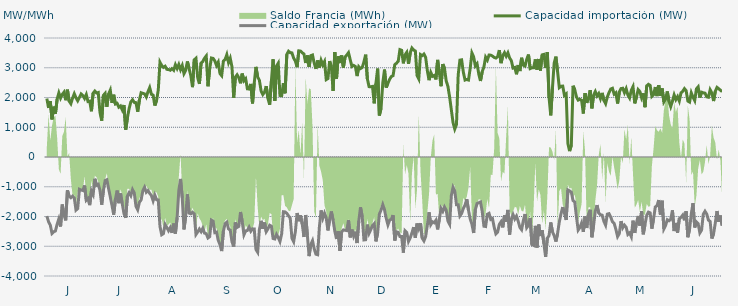
| Category | Capacidad importación (MW) | Capacidad exportación (MW) |
|---|---|---|
| 0 | 1964.583 | -1985.792 |
| 1900-01-01 | 1650 | -2177.417 |
| 1900-01-02 | 1877.083 | -2287.667 |
| 1900-01-03 | 1264.583 | -2568.708 |
| 1900-01-04 | 1691.667 | -2512.667 |
| 1900-01-05 | 1456.25 | -2486.333 |
| 1900-01-06 | 1945.833 | -2259.083 |
| 1900-01-07 | 2154.167 | -2079.5 |
| 1900-01-08 | 1979.167 | -2336.083 |
| 1900-01-09 | 2104.167 | -1597.917 |
| 1900-01-10 | 2179.167 | -1954.167 |
| 1900-01-11 | 1908.333 | -2131.25 |
| 1900-01-12 | 2262.5 | -1118.75 |
| 1900-01-13 | 1879.167 | -1314.583 |
| 1900-01-14 | 1791.667 | -1368 |
| 1900-01-15 | 1977.083 | -1316.667 |
| 1900-01-16 | 2127.083 | -1377.083 |
| 1900-01-17 | 1987.5 | -1785.417 |
| 1900-01-18 | 1887.5 | -1733.333 |
| 1900-01-19 | 2002.083 | -1085.417 |
| 1900-01-20 | 2118.75 | -1110.417 |
| 1900-01-21 | 2066.667 | -1125 |
| 1900-01-22 | 1966.667 | -958.333 |
| 1900-01-23 | 2097.917 | -1454.167 |
| 1900-01-24 | 1864.583 | -1397.917 |
| 1900-01-25 | 1877.083 | -1618.75 |
| 1900-01-26 | 1537.5 | -1143.75 |
| 1900-01-27 | 2145.833 | -1264 |
| 1900-01-28 | 2216.667 | -731.25 |
| 1900-01-29 | 2150 | -950 |
| 1900-01-30 | 2167.583 | -916.667 |
| 1900-01-31 | 1493.75 | -1122.25 |
| 1900-02-01 | 1220.833 | -1604.167 |
| 1900-02-02 | 2072.917 | -1125 |
| 1900-02-03 | 2139.583 | -791.667 |
| 1900-02-04 | 1687.5 | -764.583 |
| 1900-02-05 | 2116.667 | -1058.333 |
| 1900-02-06 | 2247.917 | -1337.5 |
| 1900-02-07 | 1818.75 | -1627.083 |
| 1900-02-08 | 2093.75 | -1937.5 |
| 1900-02-09 | 1781.25 | -1422.917 |
| 1900-02-10 | 1804.167 | -1127.083 |
| 1900-02-11 | 1675 | -1552.083 |
| 1900-02-12 | 1716.667 | -1225 |
| 1900-02-13 | 1583.333 | -1570.833 |
| 1900-02-14 | 1747.917 | -1904.167 |
| 1900-02-15 | 918.75 | -2042.875 |
| 1900-02-16 | 1314.583 | -1310.417 |
| 1900-02-17 | 1629.167 | -1200 |
| 1900-02-18 | 1852.083 | -1300.583 |
| 1900-02-19 | 1925 | -1095.833 |
| 1900-02-20 | 1835.417 | -1208.333 |
| 1900-02-21 | 1827.083 | -1656.25 |
| 1900-02-22 | 1522.917 | -1770.917 |
| 1900-02-23 | 1916.667 | -1518.75 |
| 1900-02-24 | 2160.417 | -1441.667 |
| 1900-02-25 | 2139.583 | -1137.5 |
| 1900-02-26 | 2120.833 | -1018.75 |
| 1900-02-27 | 2018.75 | -1183.333 |
| 1900-02-28 | 2193.75 | -1127.083 |
| 1900-02-28 | 2333.333 | -1220.833 |
| 1900-03-01 | 2108.333 | -1295.833 |
| 1900-03-02 | 2079.833 | -1472.917 |
| 1900-03-03 | 1729.167 | -1281.25 |
| 1900-03-04 | 1897.917 | -1434.542 |
| 1900-03-05 | 2247 | -1443.75 |
| 1900-03-06 | 3185.083 | -2337 |
| 1900-03-07 | 3075.167 | -2613.625 |
| 1900-03-08 | 3013.625 | -2576.5 |
| 1900-03-09 | 3052.042 | -2269.25 |
| 1900-03-10 | 2946.333 | -2370.833 |
| 1900-03-11 | 2940.542 | -2478.958 |
| 1900-03-12 | 2917.208 | -2375.625 |
| 1900-03-13 | 2971.167 | -2551.875 |
| 1900-03-14 | 2917.292 | -2238 |
| 1900-03-15 | 3101.958 | -2573.167 |
| 1900-03-16 | 2973.375 | -2041.667 |
| 1900-03-17 | 3109.875 | -1120.167 |
| 1900-03-18 | 2936.333 | -737.5 |
| 1900-03-19 | 3074.833 | -1371.667 |
| 1900-03-20 | 2802.417 | -2434.917 |
| 1900-03-21 | 2913.625 | -1996.875 |
| 1900-03-22 | 3212.125 | -1254.167 |
| 1900-03-23 | 2973 | -1887.5 |
| 1900-03-24 | 2732 | -1910.417 |
| 1900-03-25 | 2348.333 | -1858 |
| 1900-03-26 | 3266 | -1911.25 |
| 1900-03-27 | 3318.417 | -2603.917 |
| 1900-03-28 | 2666.292 | -2519.292 |
| 1900-03-29 | 2457.667 | -2420.375 |
| 1900-03-30 | 3159.917 | -2510.583 |
| 1900-03-31 | 3208.208 | -2395.833 |
| 1900-04-01 | 3322.042 | -2559.25 |
| 1900-04-02 | 3397.292 | -2579.208 |
| 1900-04-03 | 2377.292 | -2722 |
| 1900-04-04 | 2966.875 | -2678.583 |
| 1900-04-05 | 3327.583 | -2120.833 |
| 1900-04-06 | 3314.125 | -2154.167 |
| 1900-04-07 | 3229.625 | -2542.417 |
| 1900-04-08 | 3075.125 | -2524.125 |
| 1900-04-09 | 3186.833 | -2800.875 |
| 1900-04-10 | 2804.417 | -2944.208 |
| 1900-04-11 | 2733.75 | -3162.5 |
| 1900-04-12 | 3225.458 | -2491.042 |
| 1900-04-13 | 3275.667 | -2238.417 |
| 1900-04-14 | 3439.5 | -2190.417 |
| 1900-04-15 | 3175.292 | -2417.375 |
| 1900-04-16 | 3321.875 | -2458.417 |
| 1900-04-17 | 3034.917 | -2846.167 |
| 1900-04-18 | 1991.917 | -3010.667 |
| 1900-04-19 | 2685.833 | -2200.25 |
| 1900-04-20 | 2763.167 | -2365.208 |
| 1900-04-21 | 2664.875 | -2334.375 |
| 1900-04-22 | 2477.792 | -1849.417 |
| 1900-04-23 | 2804.25 | -2175.083 |
| 1900-04-24 | 2563.458 | -2614.833 |
| 1900-04-25 | 2629.917 | -2484.333 |
| 1900-04-26 | 2292 | -2469.792 |
| 1900-04-27 | 2284.542 | -2356.917 |
| 1900-04-28 | 2456.5 | -2494.792 |
| 1900-04-29 | 1801.792 | -2413.833 |
| 1900-04-30 | 2484.917 | -2419 |
| 1900-05-01 | 3029.417 | -3108.292 |
| 1900-05-02 | 2693.417 | -3201.125 |
| 1900-05-03 | 2579.5 | -2439 |
| 1900-05-04 | 2220.833 | -2146.167 |
| 1900-05-05 | 2100 | -2410.292 |
| 1900-05-06 | 2179.167 | -2202.083 |
| 1900-05-07 | 2381.25 | -2508.5 |
| 1900-05-08 | 1970.833 | -2414.375 |
| 1900-05-09 | 1758.333 | -2292.792 |
| 1900-05-10 | 2544 | -2324.083 |
| 1900-05-11 | 3285.125 | -2739.75 |
| 1900-05-12 | 1885.375 | -2754.917 |
| 1900-05-13 | 3057.958 | -2601 |
| 1900-05-14 | 3152.583 | -2708.375 |
| 1900-05-15 | 2068.833 | -2840.833 |
| 1900-05-16 | 2060.917 | -2586.417 |
| 1900-05-17 | 2484.25 | -1839.417 |
| 1900-05-18 | 2141.208 | -1845.833 |
| 1900-05-19 | 3445.375 | -1893.75 |
| 1900-05-20 | 3555.25 | -1979.583 |
| 1900-05-21 | 3506.875 | -2054.167 |
| 1900-05-22 | 3499.292 | -2730 |
| 1900-05-23 | 3321.917 | -2848.375 |
| 1900-05-24 | 3225.583 | -2505.583 |
| 1900-05-25 | 3019.583 | -1882.958 |
| 1900-05-26 | 3568.667 | -2157.833 |
| 1900-05-27 | 3559.375 | -1957.75 |
| 1900-05-28 | 3503.125 | -2252.375 |
| 1900-05-29 | 3464.458 | -2689.458 |
| 1900-05-30 | 3159.52 | -1949.52 |
| 1900-05-31 | 3414.875 | -2624.75 |
| 1900-06-01 | 3028.417 | -3331.875 |
| 1900-06-02 | 3406.833 | -2936.5 |
| 1900-06-03 | 3428.875 | -2811.25 |
| 1900-06-04 | 3154.208 | -3088.625 |
| 1900-06-05 | 2961.542 | -3268.083 |
| 1900-06-06 | 3246.75 | -3285.125 |
| 1900-06-07 | 2998.792 | -2359.333 |
| 1900-06-08 | 3250.625 | -1795.833 |
| 1900-06-09 | 3098.083 | -2058.458 |
| 1900-06-10 | 3208.458 | -1889.583 |
| 1900-06-11 | 2600.833 | -2050 |
| 1900-06-12 | 2636.458 | -2468.208 |
| 1900-06-13 | 3221.75 | -2100 |
| 1900-06-14 | 3030.917 | -1831.25 |
| 1900-06-15 | 2221.417 | -2127.083 |
| 1900-06-16 | 3529.833 | -2490.5 |
| 1900-06-17 | 2631.583 | -2756.25 |
| 1900-06-18 | 3389.417 | -2493.667 |
| 1900-06-19 | 3161.917 | -3158.375 |
| 1900-06-20 | 3412.417 | -2518.792 |
| 1900-06-21 | 3004.917 | -2450.333 |
| 1900-06-22 | 3360.75 | -2463.25 |
| 1900-06-23 | 3427.958 | -2474.292 |
| 1900-06-24 | 3506.917 | -2123.5 |
| 1900-06-25 | 3269.708 | -2701.708 |
| 1900-06-26 | 3043.333 | -2440.417 |
| 1900-06-27 | 3078.833 | -2660.667 |
| 1900-06-28 | 3042.542 | -2510.25 |
| 1900-06-29 | 2720.083 | -2892.208 |
| 1900-06-30 | 3035.792 | -2156.833 |
| 1900-07-01 | 2973.125 | -1691.667 |
| 1900-07-02 | 3008.708 | -2006.25 |
| 1900-07-03 | 3198.417 | -2788.271 |
| 1900-07-04 | 3439.5 | -2780.875 |
| 1900-07-05 | 2626.625 | -2273 |
| 1900-07-06 | 2364.583 | -2564.167 |
| 1900-07-07 | 2360.417 | -2440.708 |
| 1900-07-08 | 2372.917 | -2302.125 |
| 1900-07-09 | 1804.167 | -2241.25 |
| 1900-07-10 | 2476.875 | -2836.292 |
| 1900-07-11 | 2972.208 | -2552.292 |
| 1900-07-12 | 1394.917 | -1922 |
| 1900-07-13 | 1635.417 | -1780.667 |
| 1900-07-14 | 2487.208 | -1602.083 |
| 1900-07-15 | 2938.333 | -1770.833 |
| 1900-07-16 | 2333.708 | -2058.75 |
| 1900-07-17 | 2480.333 | -2280.5 |
| 1900-07-18 | 2612.458 | -2120.333 |
| 1900-07-19 | 2705.792 | -2095.25 |
| 1900-07-20 | 2735.375 | -1951.833 |
| 1900-07-21 | 3100.375 | -2807.583 |
| 1900-07-22 | 3154.125 | -2514.417 |
| 1900-07-23 | 3216.042 | -2530.208 |
| 1900-07-24 | 3609.167 | -2672.875 |
| 1900-07-25 | 3585.958 | -2674.5 |
| 1900-07-26 | 3148.417 | -3214.25 |
| 1900-07-27 | 3433.542 | -2480.667 |
| 1900-07-28 | 3518.5 | -2539.5 |
| 1900-07-29 | 3130.292 | -2838.583 |
| 1900-07-30 | 3499.167 | -2718.417 |
| 1900-07-31 | 3663.042 | -2554.083 |
| 1900-08-01 | 3596.708 | -2355.75 |
| 1900-08-02 | 3562.792 | -2716.417 |
| 1900-08-03 | 2738.75 | -2235.333 |
| 1900-08-04 | 2625.667 | -2410 |
| 1900-08-05 | 3444.083 | -2226.333 |
| 1900-08-06 | 3408.75 | -2728 |
| 1900-08-07 | 3460.583 | -2820.25 |
| 1900-08-08 | 3350.75 | -2676.083 |
| 1900-08-09 | 2899.917 | -2289.583 |
| 1900-08-10 | 2581.708 | -1858.083 |
| 1900-08-11 | 2842.042 | -2272.417 |
| 1900-08-12 | 2711.125 | -2177.417 |
| 1900-08-13 | 2740.458 | -2209.667 |
| 1900-08-14 | 2608.583 | -2127.083 |
| 1900-08-15 | 3264.042 | -2433.083 |
| 1900-08-16 | 2836.375 | -2085.417 |
| 1900-08-17 | 2379.792 | -1727.083 |
| 1900-08-18 | 3123.25 | -1827.083 |
| 1900-08-19 | 2982.792 | -1681.25 |
| 1900-08-20 | 2556.667 | -1789.667 |
| 1900-08-21 | 2375.667 | -2149.333 |
| 1900-08-22 | 2017.208 | -2261.458 |
| 1900-08-23 | 1585 | -1297.917 |
| 1900-08-24 | 1154.167 | -1022.917 |
| 1900-08-25 | 939.583 | -1143.75 |
| 1900-08-26 | 1093.75 | -1604.167 |
| 1900-08-27 | 2763.333 | -1604.167 |
| 1900-08-28 | 3256.375 | -1980.875 |
| 1900-08-29 | 3265.958 | -1897.917 |
| 1900-08-30 | 2849.625 | -1726.333 |
| 1900-08-31 | 2586.542 | -1614.583 |
| 1900-09-01 | 2607.375 | -1416.667 |
| 1900-09-02 | 2587.208 | -1789.583 |
| 1900-09-03 | 2978.5 | -2081.25 |
| 1900-09-04 | 3497.083 | -2256.292 |
| 1900-09-05 | 3370 | -2554.542 |
| 1900-09-06 | 3061.75 | -1771.917 |
| 1900-09-07 | 3134.875 | -1562.5 |
| 1900-09-08 | 2789.5 | -1537.5 |
| 1900-09-09 | 2555.75 | -1512.5 |
| 1900-09-10 | 2867.083 | -1825 |
| 1900-09-11 | 3026.833 | -2326.458 |
| 1900-09-12 | 3354.833 | -2337.292 |
| 1900-09-13 | 3258.292 | -1924.167 |
| 1900-09-14 | 3426.125 | -1893.75 |
| 1900-09-15 | 3424.167 | -2100 |
| 1900-09-16 | 3391.208 | -2070.833 |
| 1900-09-17 | 3348.208 | -2362.208 |
| 1900-09-18 | 3325.958 | -2584.917 |
| 1900-09-19 | 3372.292 | -2526.125 |
| 1900-09-20 | 3594.458 | -2261.833 |
| 1900-09-21 | 3154.208 | -2177.542 |
| 1900-09-22 | 3406.542 | -2366 |
| 1900-09-23 | 3506.792 | -1962 |
| 1900-09-24 | 3388.292 | -2170.833 |
| 1900-09-25 | 3502.625 | -1778.917 |
| 1900-09-26 | 3329.875 | -2606.583 |
| 1900-09-27 | 3238.958 | -2081.917 |
| 1900-09-28 | 2990.542 | -1937.25 |
| 1900-09-29 | 3009.542 | -2084.208 |
| 1900-09-30 | 2780.333 | -1987.25 |
| 1900-10-01 | 3090.792 | -2157.25 |
| 1900-10-02 | 2889.375 | -2369.167 |
| 1900-10-03 | 3335.375 | -2443.917 |
| 1900-10-04 | 3086.625 | -2135.417 |
| 1900-10-05 | 3054 | -1916.417 |
| 1900-10-06 | 3285.417 | -2373 |
| 1900-10-07 | 3443.292 | -2289.333 |
| 1900-10-08 | 2971.208 | -2047.917 |
| 1900-10-09 | 2996.292 | -2944.458 |
| 1900-10-10 | 3001.167 | -2971.542 |
| 1900-10-11 | 3281.375 | -2314.833 |
| 1900-10-12 | 2936.042 | -3043.167 |
| 1900-10-13 | 3294.792 | -2270.333 |
| 1900-10-14 | 2907.375 | -2657.667 |
| 1900-10-15 | 3433.583 | -2462.5 |
| 1900-10-16 | 3449.042 | -2914.583 |
| 1900-10-17 | 2992.458 | -3358.458 |
| 1900-10-18 | 3524.375 | -2728.208 |
| 1900-10-19 | 2000 | -2643.375 |
| 1900-10-20 | 1400 | -2200 |
| 1900-10-21 | 2323.375 | -2514.75 |
| 1900-10-22 | 3160.167 | -2645.333 |
| 1900-10-23 | 3372.083 | -2842.167 |
| 1900-10-24 | 2865.739 | -2564.565 |
| 1900-10-25 | 2332.667 | -2181.833 |
| 1900-10-26 | 2376.083 | -1906.25 |
| 1900-10-27 | 2381.25 | -1683.333 |
| 1900-10-28 | 2070.833 | -1891.667 |
| 1900-10-29 | 2120.083 | -2118.75 |
| 1900-10-30 | 449.25 | -1108.333 |
| 1900-10-31 | 200 | -1139.583 |
| 1900-11-01 | 395.833 | -1179.167 |
| 1900-11-02 | 2393.75 | -1462.5 |
| 1900-11-03 | 2262.25 | -1512.5 |
| 1900-11-04 | 2020.833 | -2007.167 |
| 1900-11-05 | 1912.5 | -2455.208 |
| 1900-11-06 | 1939.583 | -2371.125 |
| 1900-11-07 | 1908.333 | -2217.958 |
| 1900-11-08 | 1462.5 | -2517.542 |
| 1900-11-09 | 2145.208 | -2000.417 |
| 1900-11-10 | 1820.833 | -2386.167 |
| 1900-11-11 | 1983.333 | -1930.75 |
| 1900-11-12 | 2245.833 | -1772.917 |
| 1900-11-13 | 1635.417 | -2697.5 |
| 1900-11-14 | 2079.167 | -2299.625 |
| 1900-11-15 | 2200 | -1818.75 |
| 1900-11-16 | 2052.083 | -1616.667 |
| 1900-11-17 | 2133.333 | -1885.417 |
| 1900-11-18 | 1962.5 | -1940.792 |
| 1900-11-19 | 2154.167 | -1955.875 |
| 1900-11-20 | 1906.25 | -2160.458 |
| 1900-11-21 | 1791.667 | -2289.583 |
| 1900-11-22 | 2014.583 | -1920.333 |
| 1900-11-23 | 2166.667 | -1904.167 |
| 1900-11-24 | 2285.417 | -2016.25 |
| 1900-11-25 | 2310.417 | -2177.917 |
| 1900-11-26 | 2114.583 | -2230.875 |
| 1900-11-27 | 2160.417 | -2431.625 |
| 1900-11-28 | 1797.917 | -2674.417 |
| 1900-11-29 | 2180.625 | -2574 |
| 1900-11-30 | 2300 | -2155.333 |
| 1900-12-01 | 2310.417 | -2380.708 |
| 1900-12-02 | 2160.417 | -2290.5 |
| 1900-12-03 | 2295.833 | -2360.958 |
| 1900-12-04 | 2083.333 | -2603 |
| 1900-12-05 | 1983.333 | -2551.458 |
| 1900-12-06 | 2243.75 | -2680.375 |
| 1900-12-07 | 2364.583 | -2139.583 |
| 1900-12-08 | 1802.083 | -2551.375 |
| 1900-12-09 | 2012.5 | -2222.583 |
| 1900-12-10 | 2264.583 | -1983.333 |
| 1900-12-11 | 2200 | -2304.167 |
| 1900-12-12 | 1991.667 | -1823 |
| 1900-12-13 | 2139.583 | -2598.667 |
| 1900-12-14 | 1674.583 | -2262.5 |
| 1900-12-15 | 2391.667 | -1958.333 |
| 1900-12-16 | 2442.875 | -1852.083 |
| 1900-12-17 | 2406.25 | -1879.167 |
| 1900-12-18 | 2035.417 | -2408.5 |
| 1900-12-19 | 2093.75 | -2077.083 |
| 1900-12-20 | 2353.042 | -1679.167 |
| 1900-12-21 | 2047.917 | -1637.5 |
| 1900-12-22 | 2414.917 | -1445.833 |
| 1900-12-23 | 2054.167 | -1935.417 |
| 1900-12-24 | 2304.167 | -1468.75 |
| 1900-12-25 | 1852.083 | -2413.583 |
| 1900-12-26 | 1950 | -2298.583 |
| 1900-12-27 | 2204.167 | -2108.333 |
| 1900-12-28 | 1870.833 | -2142.875 |
| 1900-12-29 | 1693.75 | -2094.083 |
| 1900-12-30 | 1875 | -1793.75 |
| 1900-12-31 | 2087.5 | -2489.25 |
| 1901-01-01 | 1929.167 | -2216.167 |
| 1901-01-02 | 2031.25 | -2542 |
| 1901-01-03 | 1885.417 | -2072.833 |
| 1901-01-04 | 2156.25 | -2029.167 |
| 1901-01-05 | 2208.333 | -1953 |
| 1901-01-06 | 2297.917 | -2127.083 |
| 1901-01-07 | 2229.167 | -1822.917 |
| 1901-01-08 | 1879.167 | -2695.583 |
| 1901-01-09 | 1845.833 | -2427.667 |
| 1901-01-10 | 2156.25 | -1908.417 |
| 1901-01-11 | 2010.417 | -1551.375 |
| 1901-01-12 | 1897.625 | -2367.333 |
| 1901-01-13 | 2291.667 | -2179.167 |
| 1901-01-14 | 2358.333 | -2236.833 |
| 1901-01-15 | 1997.917 | -2551.708 |
| 1901-01-16 | 2179.167 | -2457.875 |
| 1901-01-17 | 2156.25 | -1922.667 |
| 1901-01-18 | 2145.833 | -1823.917 |
| 1901-01-19 | 2022.917 | -1916.417 |
| 1901-01-20 | 2008.333 | -2121.167 |
| 1901-01-21 | 2260.417 | -2164.667 |
| 1901-01-22 | 2152.083 | -2739.958 |
| 1901-01-23 | 1881 | -2582.833 |
| 1901-01-24 | 2206.25 | -2222.083 |
| 1901-01-25 | 2339.583 | -1816.667 |
| 1901-01-26 | 2293.75 | -2177.833 |
| 1901-01-27 | 2245.833 | -1968.75 |
| 1901-01-28 | 2195.833 | -2304.458 |